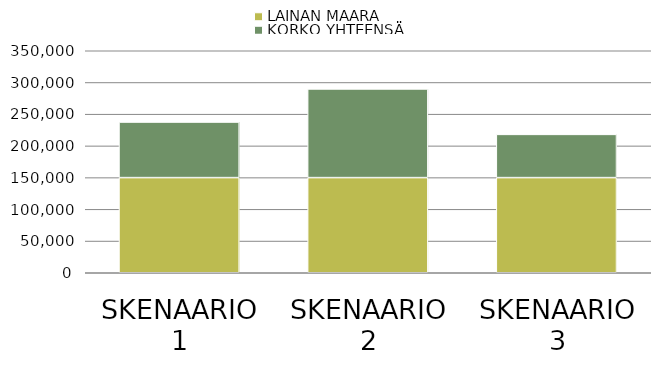
| Category | LAINAN MÄÄRÄ | KORKO YHTEENSÄ |
|---|---|---|
| SKENAARIO 1 | 150000 | 87584.066 |
| SKENAARIO 2 | 150000 | 139753.762 |
| SKENAARIO 3 | 150000 | 68152.919 |